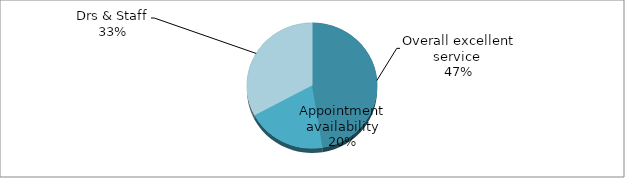
| Category | Series 0 |
|---|---|
| Overall excellent service  | 65 |
| Appointment availability | 27 |
| Drs & Staff | 45 |